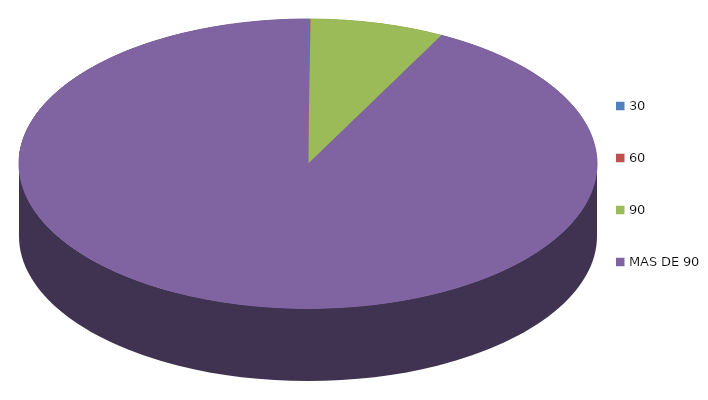
| Category | Series 0 | 35,906.6 |
|---|---|---|
| 0 | 35906.6 |  |
| 1 | 36373.4 |  |
| 2 | 3873440.7 |  |
| 3 | 47716788.3 |  |